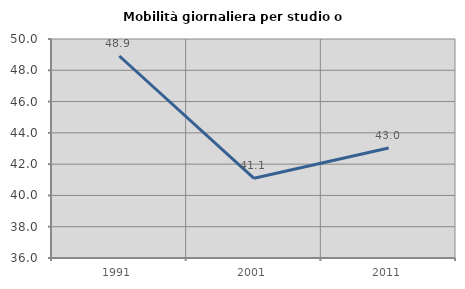
| Category | Mobilità giornaliera per studio o lavoro |
|---|---|
| 1991.0 | 48.913 |
| 2001.0 | 41.094 |
| 2011.0 | 43.037 |